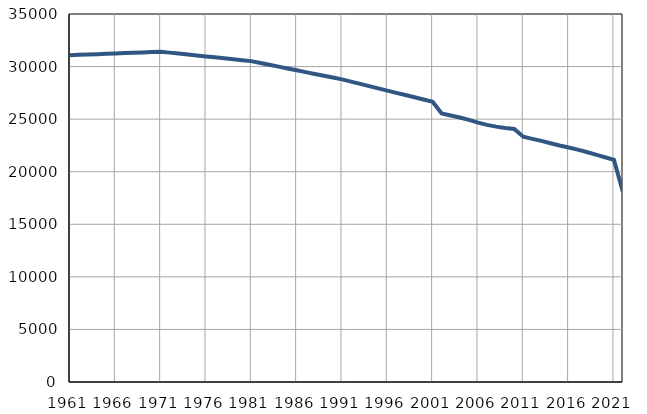
| Category | Број
становника |
|---|---|
| 1961.0 | 31081 |
| 1962.0 | 31115 |
| 1963.0 | 31148 |
| 1964.0 | 31182 |
| 1965.0 | 31215 |
| 1966.0 | 31249 |
| 1967.0 | 31282 |
| 1968.0 | 31316 |
| 1969.0 | 31349 |
| 1970.0 | 31383 |
| 1971.0 | 31416 |
| 1972.0 | 31326 |
| 1973.0 | 31237 |
| 1974.0 | 31147 |
| 1975.0 | 31057 |
| 1976.0 | 30968 |
| 1977.0 | 30878 |
| 1978.0 | 30788 |
| 1979.0 | 30698 |
| 1980.0 | 30609 |
| 1981.0 | 30519 |
| 1982.0 | 30345 |
| 1983.0 | 30171 |
| 1984.0 | 29997 |
| 1985.0 | 29823 |
| 1986.0 | 29648 |
| 1987.0 | 29475 |
| 1988.0 | 29301 |
| 1989.0 | 29128 |
| 1990.0 | 28954 |
| 1991.0 | 28779 |
| 1992.0 | 28566 |
| 1993.0 | 28354 |
| 1994.0 | 28141 |
| 1995.0 | 27928 |
| 1996.0 | 27716 |
| 1997.0 | 27503 |
| 1998.0 | 27291 |
| 1999.0 | 27078 |
| 2000.0 | 26865 |
| 2001.0 | 26653 |
| 2002.0 | 25531 |
| 2003.0 | 25341 |
| 2004.0 | 25155 |
| 2005.0 | 24930 |
| 2006.0 | 24673 |
| 2007.0 | 24457 |
| 2008.0 | 24288 |
| 2009.0 | 24156 |
| 2010.0 | 24060 |
| 2011.0 | 23329 |
| 2012.0 | 23125 |
| 2013.0 | 22933 |
| 2014.0 | 22705 |
| 2015.0 | 22490 |
| 2016.0 | 22302 |
| 2017.0 | 22100 |
| 2018.0 | 21876 |
| 2019.0 | 21630 |
| 2020.0 | 21376 |
| 2021.0 | 21120 |
| 2022.0 | 18048 |